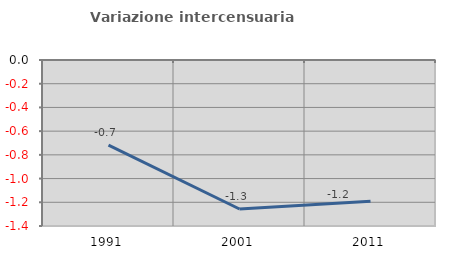
| Category | Variazione intercensuaria annua |
|---|---|
| 1991.0 | -0.717 |
| 2001.0 | -1.257 |
| 2011.0 | -1.191 |